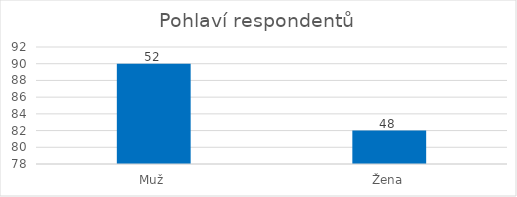
| Category | Počet respondentů |
|---|---|
| Muž | 90 |
| Žena | 82 |